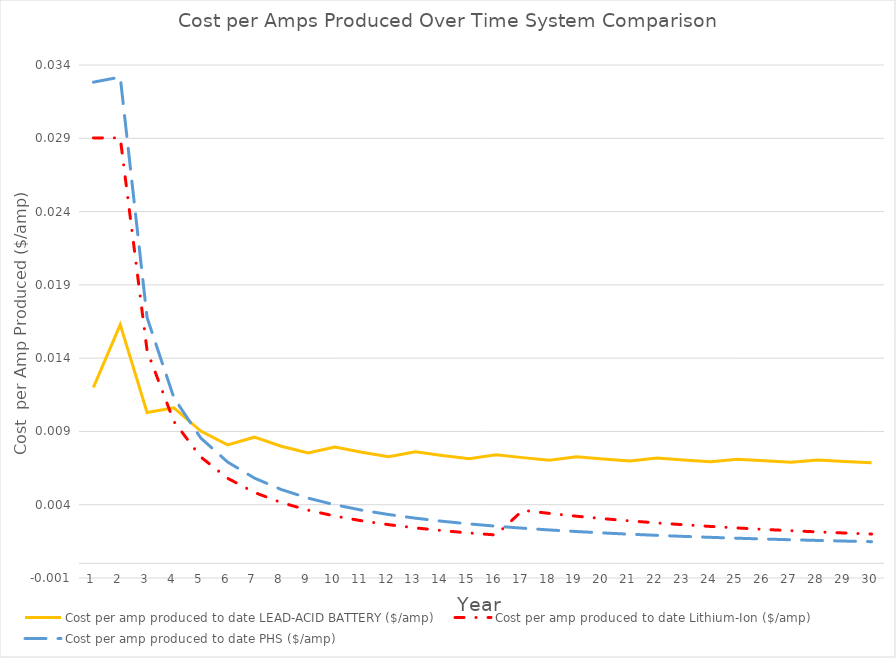
| Category | Cost per amp produced to date LEAD-ACID BATTERY ($/amp) | Cost per amp produced to date Lithium-Ion ($/amp) | Cost per amp produced to date PHS ($/amp) |
|---|---|---|---|
| 0 | 0.012 | 0.029 | 0.033 |
| 1 | 0.016 | 0.029 | 0.033 |
| 2 | 0.01 | 0.015 | 0.017 |
| 3 | 0.011 | 0.01 | 0.011 |
| 4 | 0.009 | 0.007 | 0.009 |
| 5 | 0.008 | 0.006 | 0.007 |
| 6 | 0.009 | 0.005 | 0.006 |
| 7 | 0.008 | 0.004 | 0.005 |
| 8 | 0.008 | 0.004 | 0.004 |
| 9 | 0.008 | 0.003 | 0.004 |
| 10 | 0.008 | 0.003 | 0.004 |
| 11 | 0.007 | 0.003 | 0.003 |
| 12 | 0.008 | 0.002 | 0.003 |
| 13 | 0.007 | 0.002 | 0.003 |
| 14 | 0.007 | 0.002 | 0.003 |
| 15 | 0.007 | 0.002 | 0.003 |
| 16 | 0.007 | 0.004 | 0.002 |
| 17 | 0.007 | 0.003 | 0.002 |
| 18 | 0.007 | 0.003 | 0.002 |
| 19 | 0.007 | 0.003 | 0.002 |
| 20 | 0.007 | 0.003 | 0.002 |
| 21 | 0.007 | 0.003 | 0.002 |
| 22 | 0.007 | 0.003 | 0.002 |
| 23 | 0.007 | 0.003 | 0.002 |
| 24 | 0.007 | 0.002 | 0.002 |
| 25 | 0.007 | 0.002 | 0.002 |
| 26 | 0.007 | 0.002 | 0.002 |
| 27 | 0.007 | 0.002 | 0.002 |
| 28 | 0.007 | 0.002 | 0.002 |
| 29 | 0.007 | 0.002 | 0.001 |